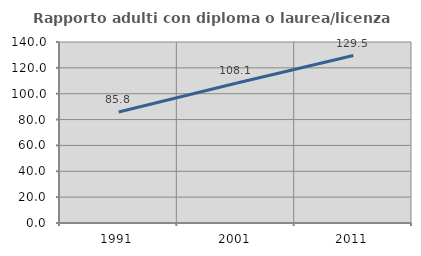
| Category | Rapporto adulti con diploma o laurea/licenza media  |
|---|---|
| 1991.0 | 85.846 |
| 2001.0 | 108.112 |
| 2011.0 | 129.549 |